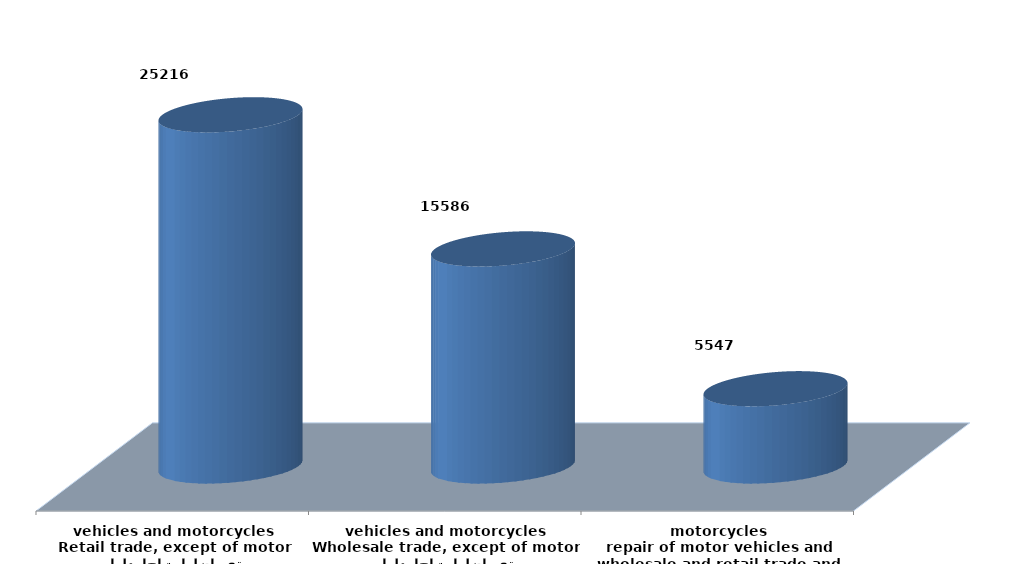
| Category | Series 0 |
|---|---|
| تجارة الجملة والتجزئة ،واصلاح المركبات ذات المحركات والدراجات النارية
wholesale and retail trade and repair of motor vehicles and motorcycles | 5546902 |
| تجارة الجملة ، باستثناء المركبات ذات المحركات والدراجات النارية
Wholesale trade, except of motor vehicles and motorcycles | 15585891 |
| تجارة التجزئة،باستثناء المركبات ذات المحركات والدراجات النارية
Retail trade, except of motor vehicles and motorcycles | 25216312 |